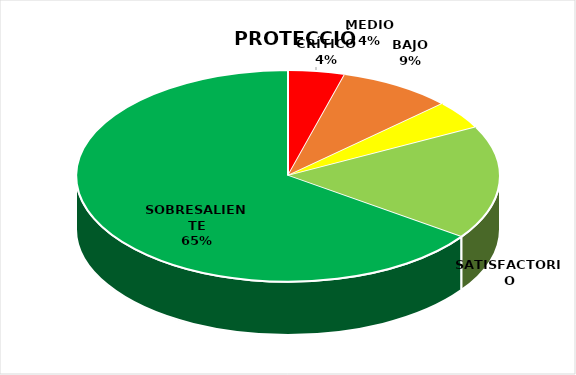
| Category | Series 0 |
|---|---|
| CRÍTICO | 1 |
| BAJO | 2 |
| MEDIO | 1 |
| SATISFACTORIO | 4 |
| SOBRESALIENTE | 15 |